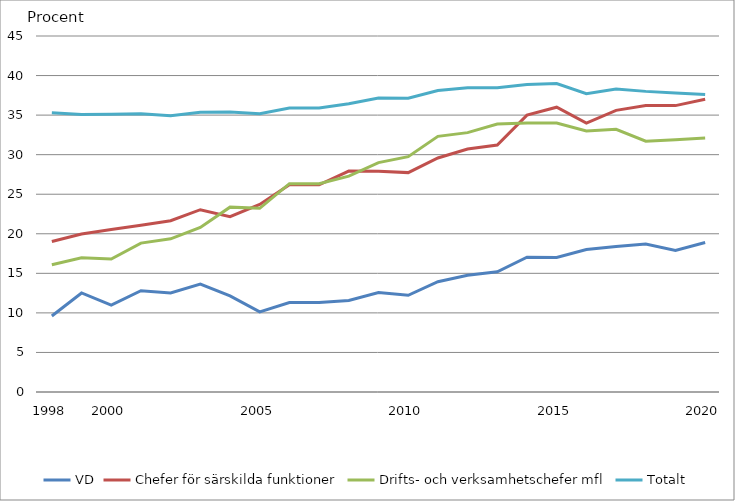
| Category | VD | Chefer för särskilda funktioner | Drifts- och verksamhetschefer mfl | Totalt |
|---|---|---|---|---|
| 1998.0 | 9.604 | 19.033 | 16.089 | 35.292 |
| nan | 12.521 | 19.982 | 16.974 | 35.071 |
| 2000.0 | 10.98 | 20.55 | 16.808 | 35.123 |
| nan | 12.797 | 21.08 | 18.819 | 35.167 |
| nan | 12.53 | 21.651 | 19.368 | 34.917 |
| nan | 13.641 | 23.042 | 20.809 | 35.372 |
| nan | 12.145 | 22.169 | 23.367 | 35.387 |
| 2005.0 | 10.126 | 23.7 | 23.22 | 35.175 |
| nan | 11.308 | 26.188 | 26.336 | 35.888 |
| nan | 11.308 | 26.188 | 26.336 | 35.888 |
| nan | 11.56 | 27.929 | 27.28 | 36.429 |
| nan | 12.574 | 27.894 | 28.99 | 37.173 |
| 2010.0 | 12.227 | 27.73 | 29.748 | 37.138 |
| nan | 13.946 | 29.585 | 32.315 | 38.103 |
| nan | 14.745 | 30.709 | 32.787 | 38.453 |
| nan | 15.187 | 31.225 | 33.875 | 38.458 |
| nan | 17.042 | 35 | 34 | 38.86 |
| 2015.0 | 17 | 36 | 34 | 39 |
| nan | 18 | 34 | 33 | 37.7 |
| nan | 18.4 | 35.6 | 33.2 | 38.3 |
| nan | 18.7 | 36.2 | 31.7 | 38 |
| nan | 17.9 | 36.2 | 31.9 | 37.8 |
| 2020.0 | 18.9 | 37 | 32.1 | 37.6 |